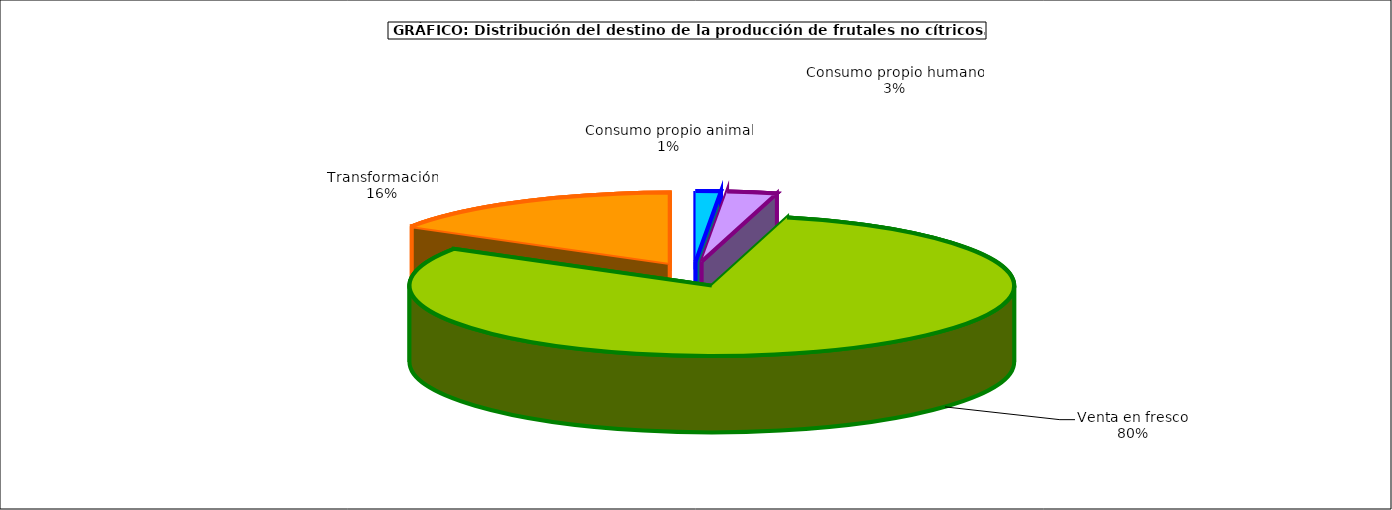
| Category | frutales no cítricos |
|---|---|
| 0 | 60034 |
| 1 | 119277 |
| 2 | 3573011 |
| 3 | 728787 |